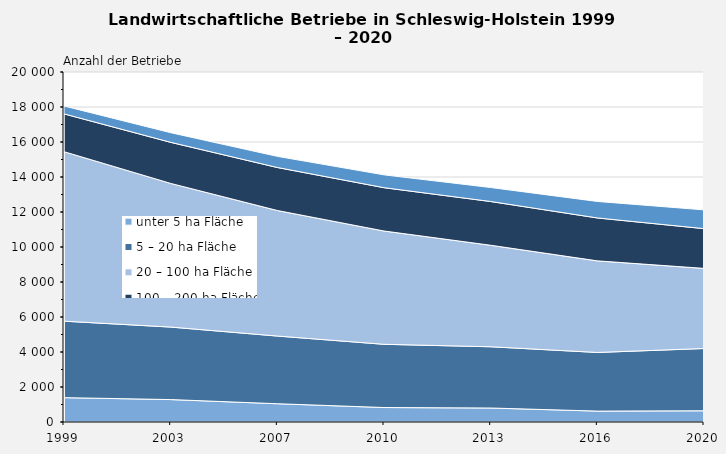
| Category | unter 5 ha Fläche | 5 – 20 ha Fläche | 20 – 100 ha Fläche | 100 – 200 ha Fläche | 200 ha und mehr Fläche |
|---|---|---|---|---|---|
| 1999.0 | 1392 | 4370 | 9685 | 2160 | 451 |
| 2003.0 | 1282 | 4143 | 8209 | 2347 | 552 |
| 2007.0 | 1044 | 3867 | 7174 | 2457 | 637 |
| 2010.0 | 827 | 3613 | 6474 | 2476 | 733 |
| 2013.0 | 800 | 3500 | 5800 | 2500 | 800 |
| 2016.0 | 623 | 3351 | 5234 | 2452 | 943 |
| 2020.0 | 641 | 3559 | 4577 | 2273 | 1072 |